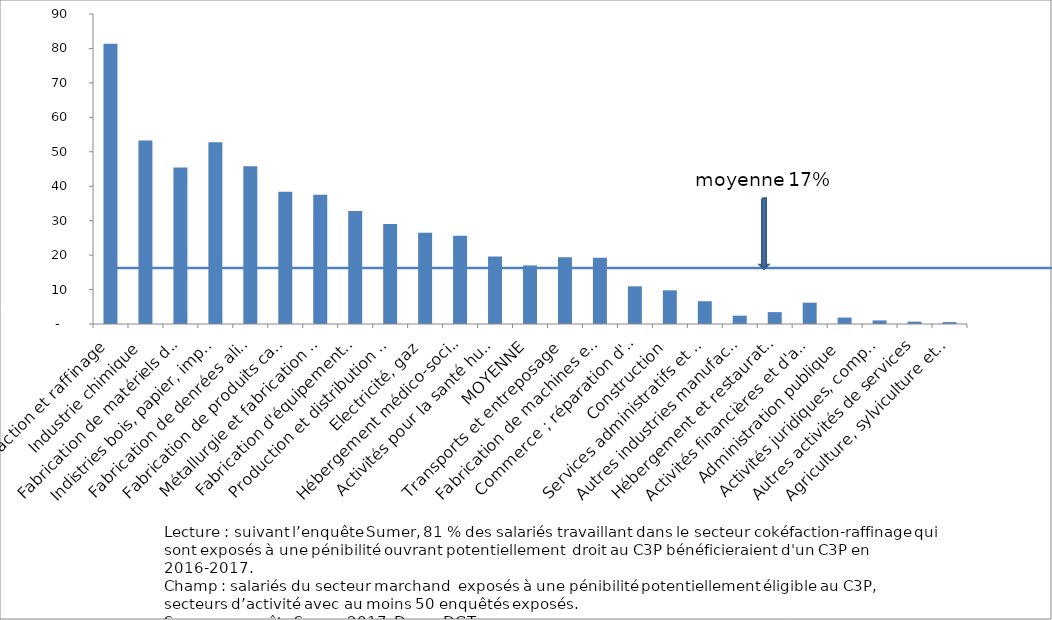
| Category | Series 0 |
|---|---|
| Cokéfaction et raffinage | 81.38 |
| Industrie chimique | 53.26 |
| Fabrication de matériels de transport | 45.44 |
| Indistries bois, papier, imprimerie | 52.75 |
| Fabrication de denrées alimentaires | 45.81 |
| Fabrication de produits caoutchouc-plastique | 38.42 |
| Métallurgie et fabrication de produits métalliques | 37.54 |
| Fabrication d'équipements électriques | 32.82 |
| Production et distribution d'eau, déchets | 29.02 |
| Electricité, gaz | 26.5 |
| Hébergement médico-social | 25.62 |
| Activités pour la santé humaine | 19.62 |
| MOYENNE | 17 |
| Transports et entreposage | 19.41 |
| Fabrication de machines et équipements  | 19.24 |
| Commerce ; réparation d'automobiles  | 10.94 |
| Construction | 9.78 |
| Services administratifs et de soutien | 6.61 |
| Autres industries manufacturières  | 2.42 |
| Hébergement et restauration | 3.45 |
| Activités financières et d'assurance | 6.19 |
| Administration publique | 1.87 |
| Activités juridiques, comptables | 1.04 |
| Autres activités de services | 0.69 |
| Agriculture, sylviculture et pêche | 0.55 |